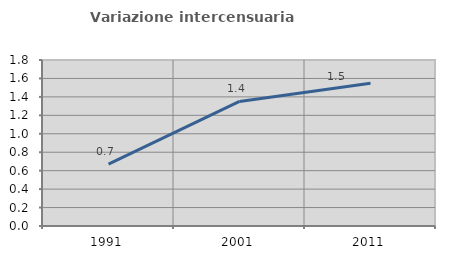
| Category | Variazione intercensuaria annua |
|---|---|
| 1991.0 | 0.671 |
| 2001.0 | 1.351 |
| 2011.0 | 1.549 |